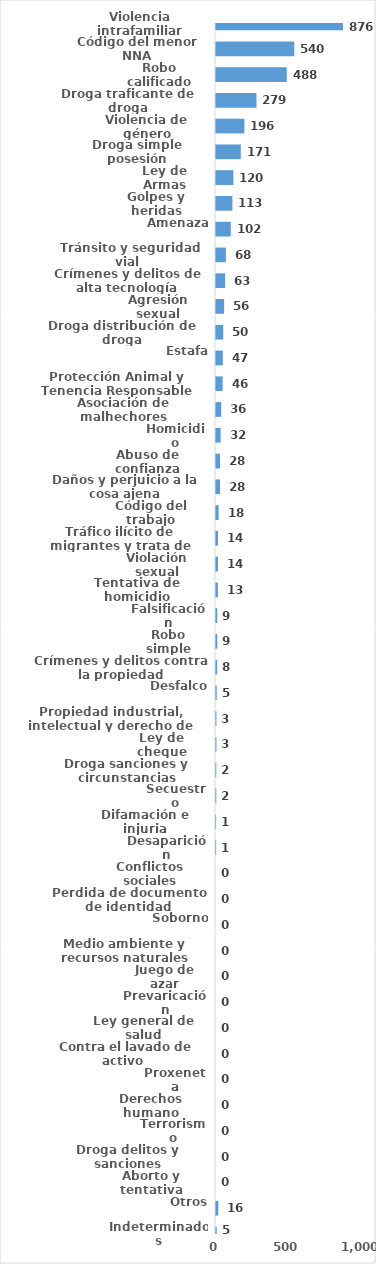
| Category | Series 0 |
|---|---|
| Violencia intrafamiliar | 876 |
| Código del menor NNA | 540 |
| Robo calificado | 488 |
| Droga traficante de droga | 279 |
| Violencia de género | 196 |
| Droga simple posesión | 171 |
| Ley de Armas | 120 |
| Golpes y heridas | 113 |
| Amenaza | 102 |
| Tránsito y seguridad vial  | 68 |
| Crímenes y delitos de alta tecnología | 63 |
| Agresión sexual | 56 |
| Droga distribución de droga | 50 |
| Estafa | 47 |
| Protección Animal y Tenencia Responsable | 46 |
| Asociación de malhechores | 36 |
| Homicidio | 32 |
| Abuso de confianza | 28 |
| Daños y perjuicio a la cosa ajena | 28 |
| Código del trabajo | 18 |
| Tráfico ilícito de migrantes y trata de personas | 14 |
| Violación sexual | 14 |
| Tentativa de homicidio | 13 |
| Falsificación | 9 |
| Robo simple | 9 |
| Crímenes y delitos contra la propiedad | 8 |
| Desfalco | 5 |
| Propiedad industrial, intelectual y derecho de autor | 3 |
| Ley de cheque | 3 |
| Droga sanciones y circunstancias agravantes | 2 |
| Secuestro | 2 |
| Difamación e injuria | 1 |
| Desaparición | 1 |
| Conflictos sociales | 0 |
| Perdida de documento de identidad | 0 |
| Soborno | 0 |
| Medio ambiente y recursos naturales | 0 |
| Juego de azar | 0 |
| Prevaricación | 0 |
| Ley general de salud | 0 |
| Contra el lavado de activo  | 0 |
| Proxeneta | 0 |
| Derechos humano | 0 |
| Terrorismo | 0 |
| Droga delitos y sanciones | 0 |
| Aborto y tentativa | 0 |
| Otros | 16 |
| Indeterminados | 5 |